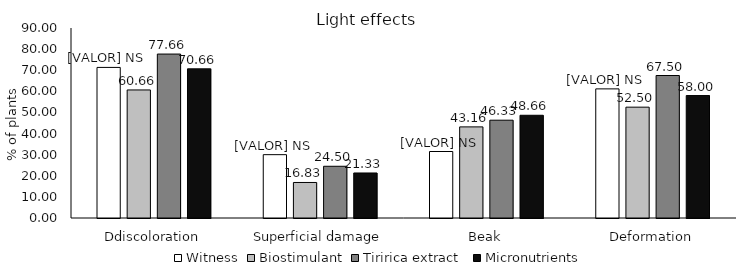
| Category | Witness | Biostimulant | Tiririca extract  | Micronutrients |
|---|---|---|---|---|
| Ddiscoloration | 71.33 | 60.66 | 77.66 | 70.66 |
| Superficial damage | 30 | 16.83 | 24.5 | 21.33 |
| Beak | 31.5 | 43.16 | 46.33 | 48.66 |
| Deformation | 61.16 | 52.5 | 67.5 | 58 |